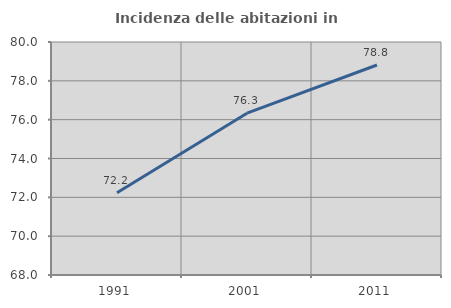
| Category | Incidenza delle abitazioni in proprietà  |
|---|---|
| 1991.0 | 72.232 |
| 2001.0 | 76.332 |
| 2011.0 | 78.817 |